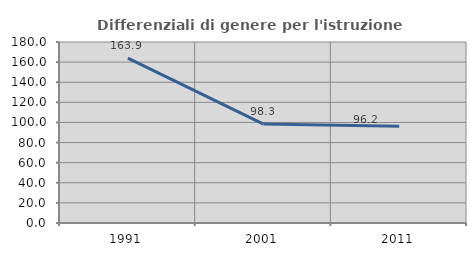
| Category | Differenziali di genere per l'istruzione superiore |
|---|---|
| 1991.0 | 163.914 |
| 2001.0 | 98.345 |
| 2011.0 | 96.238 |